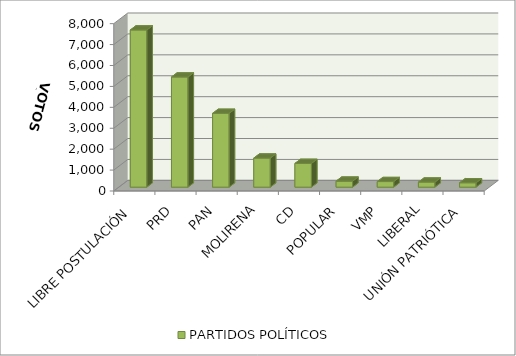
| Category | PARTIDOS POLÍTICOS |
|---|---|
| LIBRE POSTULACIÓN | 7513 |
| PRD | 5264 |
| PAN | 3527 |
| MOLIRENA | 1388 |
| CD | 1134 |
| POPULAR | 286 |
| VMP | 266 |
| LIBERAL | 240 |
| UNIÓN PATRIÓTICA | 208 |